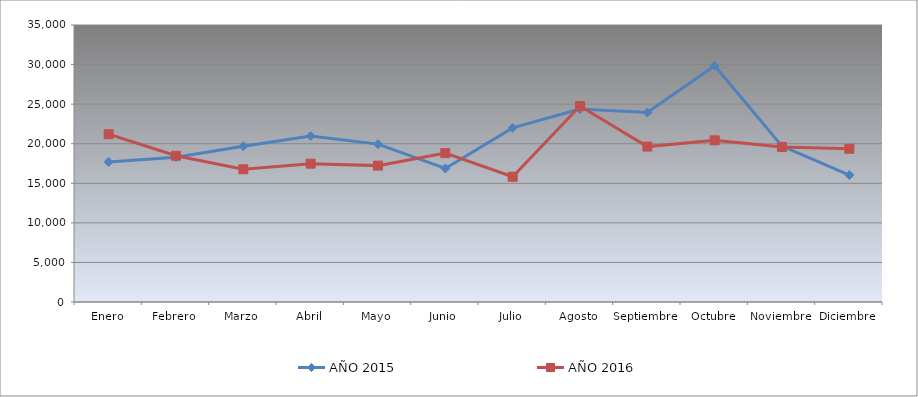
| Category | AÑO 2015 | AÑO 2016 |
|---|---|---|
| Enero | 17698.331 | 21203.269 |
| Febrero | 18303.659 | 18476.463 |
| Marzo | 19677.453 | 16775.415 |
| Abril | 20969.678 | 17478.486 |
| Mayo | 19950.065 | 17231.663 |
| Junio | 16878.348 | 18811.971 |
| Julio | 21997.877 | 15828.726 |
| Agosto | 24382.697 | 24761.367 |
| Septiembre | 23938.361 | 19636.851 |
| Octubre | 29852.115 | 20430.745 |
| Noviembre | 19696.772 | 19579.153 |
| Diciembre | 16039.045 | 19359.042 |